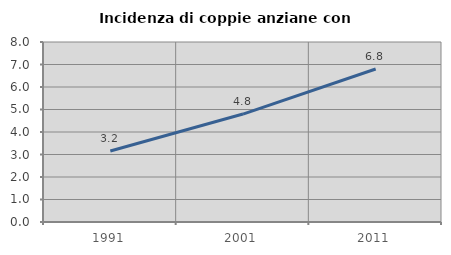
| Category | Incidenza di coppie anziane con figli |
|---|---|
| 1991.0 | 3.158 |
| 2001.0 | 4.797 |
| 2011.0 | 6.8 |